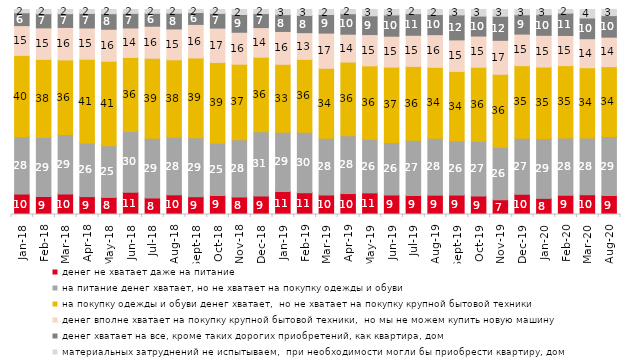
| Category | денег не хватает даже на питание | на питание денег хватает, но не хватает на покупку одежды и обуви | на покупку одежды и обуви денег хватает,  но не хватает на покупку крупной бытовой техники | денег вполне хватает на покупку крупной бытовой техники,  но мы не можем купить новую машину | денег хватает на все, кроме таких дорогих приобретений, как квартира, дом | материальных затруднений не испытываем,  при необходимости могли бы приобрести квартиру, дом |
|---|---|---|---|---|---|---|
| 2018-01-01 | 9.95 | 27.9 | 39.6 | 14.5 | 6.25 | 1.6 |
| 2018-02-01 | 8.75 | 28.65 | 38 | 15.3 | 6.9 | 2.05 |
| 2018-03-01 | 10 | 29.05 | 36.35 | 15.85 | 6.7 | 2.05 |
| 2018-04-01 | 8.7 | 26.1 | 40.75 | 15.2 | 7.1 | 1.9 |
| 2018-05-01 | 8.3 | 25.1 | 41.1 | 15.55 | 7.55 | 2.05 |
| 2018-06-01 | 10.85 | 29.6 | 36.1 | 14.35 | 7.1 | 1.9 |
| 2018-07-01 | 8 | 29.1 | 39.05 | 15.6 | 6.3 | 1.85 |
| 2018-08-01 | 9.55 | 28.05 | 37.6 | 15 | 7.65 | 1.8 |
| 2018-09-01 | 8.65 | 28.65 | 38.85 | 16.35 | 5.75 | 1.5 |
| 2018-10-01 | 9.25 | 25.45 | 39.3 | 16.7 | 7.15 | 1.9 |
| 2018-11-01 | 8.483 | 27.894 | 36.727 | 15.519 | 8.633 | 2.445 |
| 2018-12-01 | 9.05 | 31.2 | 36.25 | 14.4 | 6.8 | 2 |
| 2019-01-01 | 11.15 | 28.75 | 33.05 | 15.95 | 8.15 | 2.5 |
| 2019-02-01 | 10.6 | 29.5 | 35.55 | 13 | 8.4 | 2.9 |
| 2019-03-01 | 9.547 | 27.648 | 34.013 | 17.156 | 9.05 | 2.437 |
| 2019-04-01 | 10.198 | 28.119 | 35.891 | 13.564 | 9.95 | 2.079 |
| 2019-05-01 | 10.5 | 26.053 | 35.711 | 15.206 | 9.113 | 3.071 |
| 2019-06-01 | 9.426 | 25.536 | 36.658 | 15.012 | 10.324 | 2.643 |
| 2019-07-01 | 9.307 | 26.931 | 35.941 | 15.149 | 10.545 | 2.03 |
| 2019-08-01 | 9.391 | 27.722 | 34.466 | 15.884 | 9.79 | 2.448 |
| 2019-09-01 | 9.455 | 26.337 | 33.861 | 15.347 | 12.178 | 2.624 |
| 2019-10-01 | 9.059 | 26.584 | 36.04 | 15.198 | 9.703 | 3.218 |
| 2019-11-01 | 7.178 | 25.545 | 35.545 | 16.535 | 11.733 | 3.267 |
| 2019-12-01 | 9.851 | 27.327 | 35.297 | 15.396 | 9.406 | 2.574 |
| 2020-01-01 | 7.822 | 29.109 | 34.604 | 15.396 | 10 | 2.525 |
| 2020-02-01 | 9.406 | 27.772 | 35.198 | 14.653 | 10.842 | 1.782 |
| 2020-03-01 | 9.569 | 27.566 | 34.06 | 14.08 | 10.064 | 4.115 |
| 2020-08-01 | 9.235 | 28.699 | 34.012 | 14.35 | 10.477 | 2.979 |